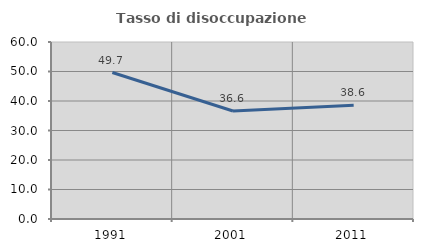
| Category | Tasso di disoccupazione giovanile  |
|---|---|
| 1991.0 | 49.655 |
| 2001.0 | 36.62 |
| 2011.0 | 38.571 |